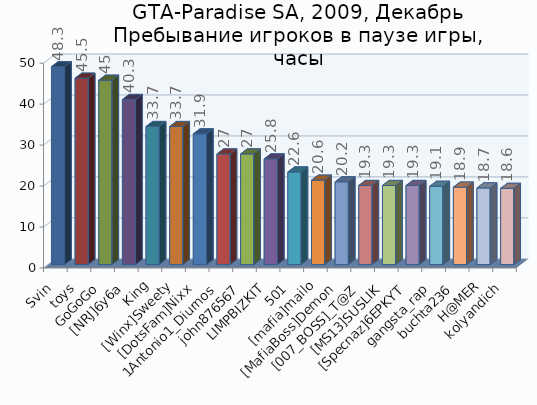
| Category | Series 0 |
|---|---|
| Svin | 48.3 |
| toys | 45.5 |
| GoGoGo | 45 |
| [NRJ]6y6a | 40.3 |
| King | 33.7 |
| [Winx]Sweety | 33.7 |
| [DotsFam]Nixx | 31.9 |
| 1Antonio1_Diurnos | 27 |
| john876567 | 27 |
| LIMPBIZKIT | 25.8 |
| 501 | 22.6 |
| [mafia]mailo | 20.6 |
| [MafiaBoss]Demon | 20.2 |
| [007_BOSS]_T@Z | 19.3 |
| [MS13]SUSLIK | 19.3 |
| [Specnaz]6EPKYT | 19.3 |
| gangsta_rap | 19.1 |
| buchta236 | 18.9 |
| H@MER | 18.7 |
| kolyandich | 18.6 |